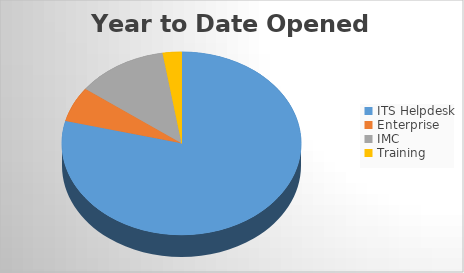
| Category | YTD Opened Tickets | 6M Opened |
|---|---|---|
| ITS Helpdesk | 1521 | 1521 |
| Enterprise | 120 | 120 |
| IMC | 237 | 237 |
| Training | 49 | 49 |